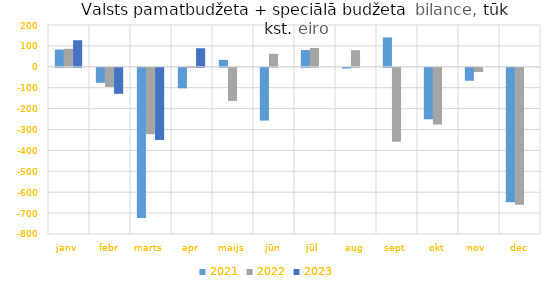
| Category | 2021 | 2022 | 2023 |
|---|---|---|---|
| janv | 82687.376 | 85977.566 | 127204.091 |
| febr | -71897.87 | -91449.582 | -124563.375 |
| marts | -718456.648 | -317726.304 | -345186.23 |
| apr | -98266.92 | 4462.198 | 88892.873 |
| maijs | 33166.776 | -158594.854 | 0 |
| jūn | -252544.202 | 62199.471 | 0 |
| jūl | 80130.309 | 89874.872 | 0 |
| aug | -3849.803 | 79584.039 | 0 |
| sept | 140699.512 | -353345.335 | 0 |
| okt | -246404.654 | -271420.986 | 0 |
| nov | -62022.59 | -20014.95 | 0 |
| dec | -643593.594 | -655267.986 | 0 |